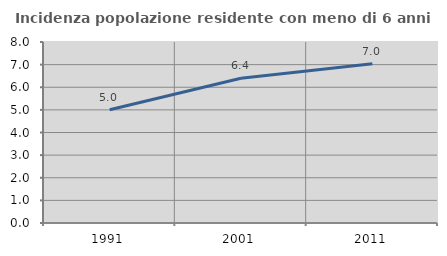
| Category | Incidenza popolazione residente con meno di 6 anni |
|---|---|
| 1991.0 | 5.007 |
| 2001.0 | 6.397 |
| 2011.0 | 7.036 |